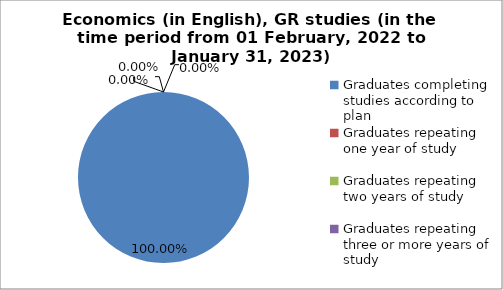
| Category | Series 0 |
|---|---|
| Graduates completing studies according to plan | 100 |
| Graduates repeating one year of study | 0 |
| Graduates repeating two years of study | 0 |
| Graduates repeating three or more years of study | 0 |